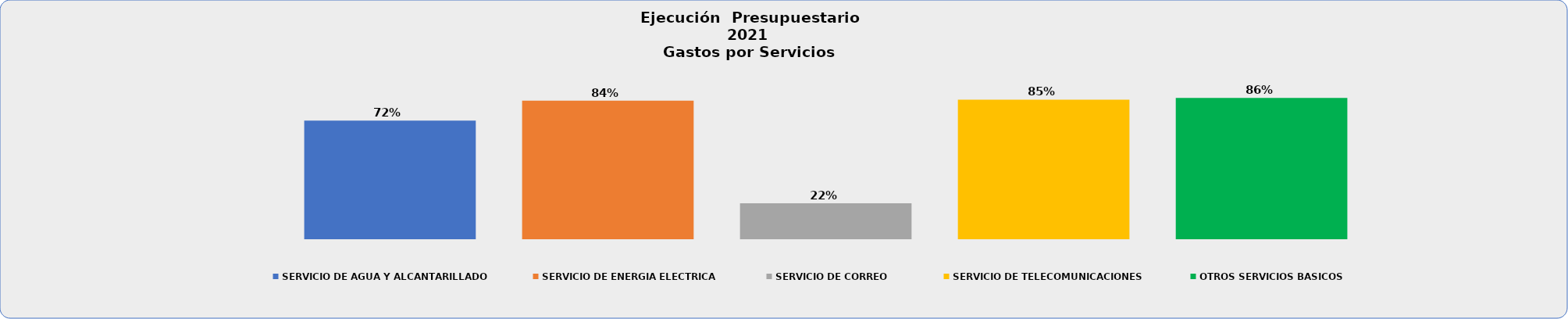
| Category | SERVICIO DE AGUA Y ALCANTARILLADO | SERVICIO DE ENERGIA ELECTRICA | SERVICIO DE CORREO | SERVICIO DE TELECOMUNICACIONES | OTROS SERVICIOS BASICOS |
|---|---|---|---|---|---|
| 0 | 0.723 | 0.844 | 0.219 | 0.85 | 0.86 |